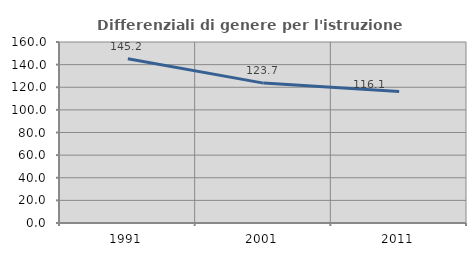
| Category | Differenziali di genere per l'istruzione superiore |
|---|---|
| 1991.0 | 145.167 |
| 2001.0 | 123.659 |
| 2011.0 | 116.142 |